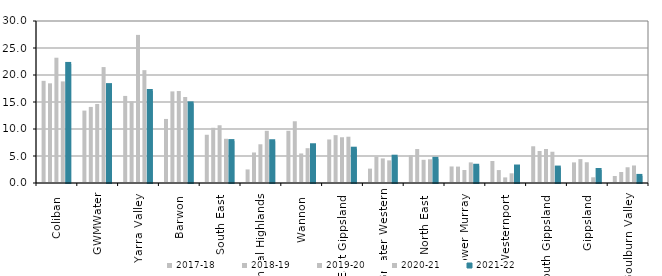
| Category | 2017-18 | 2018-19 | 2019-20 | 2020-21 | 2021-22 |
|---|---|---|---|---|---|
| Coliban  | 18.918 | 18.46 | 23.199 | 18.814 | 22.049 |
| GWMWater | 13.41 | 14.089 | 14.636 | 21.468 | 18.127 |
| Yarra Valley  | 16.124 | 15.101 | 27.426 | 20.897 | 17.036 |
| Barwon  | 11.861 | 16.964 | 17.031 | 15.931 | 14.747 |
| South East  | 8.932 | 10.222 | 10.693 | 8.189 | 7.76 |
| Central Highlands  | 2.514 | 5.651 | 7.172 | 9.662 | 7.732 |
| Wannon  | 9.671 | 11.43 | 5.472 | 6.446 | 6.989 |
| East Gippsland  | 8.062 | 8.861 | 8.47 | 8.571 | 6.351 |
| Greater Western | 2.663 | 4.869 | 4.556 | 4.191 | 4.869 |
| North East  | 5.126 | 6.291 | 4.294 | 4.39 | 4.471 |
| Lower Murray  | 3.064 | 3.04 | 2.402 | 3.818 | 3.193 |
| Westernport  | 4.072 | 2.394 | 1.037 | 1.794 | 3.053 |
| South Gippsland  | 6.8 | 5.929 | 6.294 | 5.787 | 2.857 |
| Gippsland  | 3.817 | 4.427 | 3.84 | 1.056 | 2.41 |
| Goulburn Valley  | 1.301 | 2.039 | 2.914 | 3.245 | 1.311 |